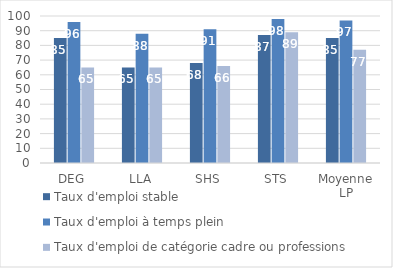
| Category | Taux d'emploi stable | Taux d'emploi à temps plein | Taux d'emploi de catégorie cadre ou professions intermédiaires |
|---|---|---|---|
| DEG | 85 | 96 | 65 |
| LLA | 65 | 88 | 65 |
| SHS | 68 | 91 | 66 |
| STS | 87 | 98 | 89 |
| Moyenne LP | 85 | 97 | 77 |